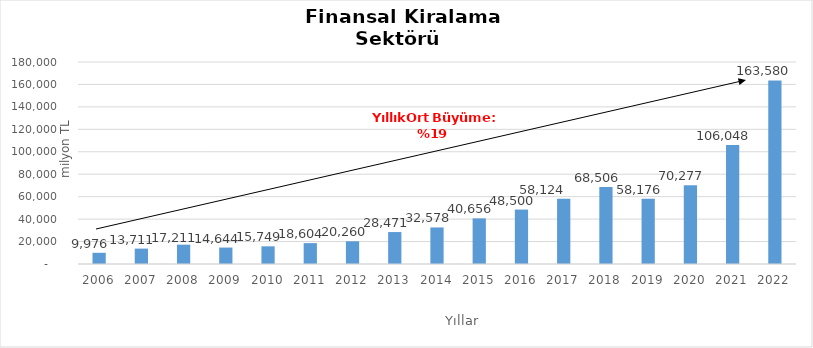
| Category | Finansal Kiralama  |
|---|---|
| 2006.0 | 9976.07 |
| 2007.0 | 13710.562 |
| 2008.0 | 17210.614 |
| 2009.0 | 14644.05 |
| 2010.0 | 15748.853 |
| 2011.0 | 18604.083 |
| 2012.0 | 20259.96 |
| 2013.0 | 28470.82 |
| 2014.0 | 32578 |
| 2015.0 | 40656 |
| 2016.0 | 48500 |
| 2017.0 | 58124 |
| 2018.0 | 68506 |
| 2019.0 | 58176 |
| 2020.0 | 70277 |
| 2021.0 | 106048 |
| 2022.0 | 163580 |